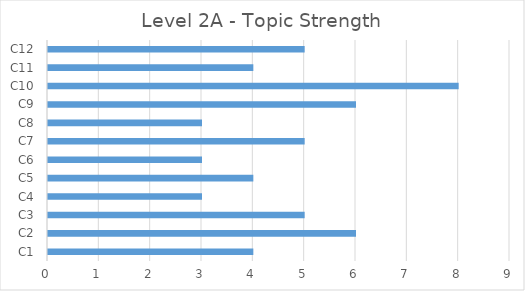
| Category | Series 0 |
|---|---|
| C1 | 4 |
| C2 | 6 |
| C3 | 5 |
| C4 | 3 |
| C5 | 4 |
| C6 | 3 |
| C7 | 5 |
| C8 | 3 |
| C9 | 6 |
| C10 | 8 |
| C11 | 4 |
| C12 | 5 |